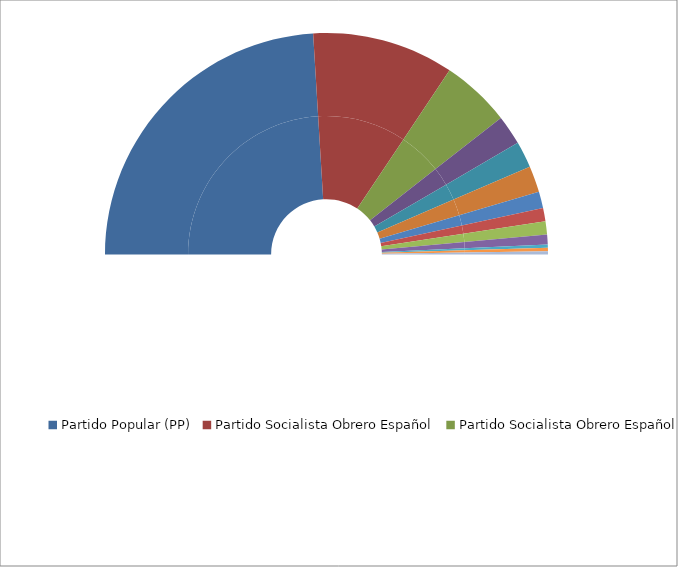
| Category | Series 0 | Series 1 |
|---|---|---|
| Partido Popular (PP) | 100 | 48.077 |
| Partido Socialista Obrero Español | 43 | 20.673 |
| Partido Socialista Obrero Español de Andalucía | 21 | 10.096 |
| Partido Popular - Partido Aragonés (PP-PAR) | 9 | 4.327 |
| Convergencia i Unió (CiU) | 8 | 3.846 |
| Partido Socialista de Galicia (PSG-PSOE)  | 8 | 3.846 |
| Partido Socialista de Euskadi-Euskadiko Ezquerra | 5 | 2.404 |
| Partit dels Socialistes de Catalunya (PSC-PSOE)  | 4 | 1.923 |
| Eusko Alderdi Jetzalea - Partido Nacionalista Vasco (EAJ - PNV))  | 4 | 1.923 |
| Unión del Pueblo Navarro - Coalición PP (UPN-PP)  | 3 | 1.442 |
| Coalición Canaria  | 1 | 0.481 |
| Partido de Independientes de Lanzarote (PIL)  | 1 | 0.481 |
| Agrupación de electores Eivissa y Formentera al Senat (EFS) | 1 | 0.481 |